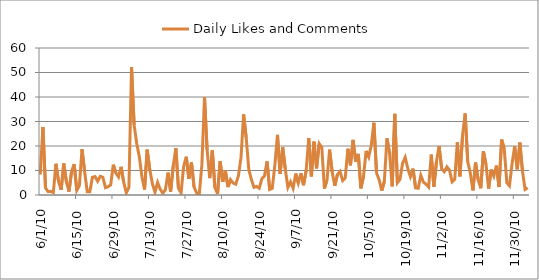
| Category | Daily Likes and Comments |
|---|---|
| 6/1/10 | 8.375 |
| 6/2/10 | 27.75 |
| 6/3/10 | 2.875 |
| 6/4/10 | 1.375 |
| 6/5/10 | 1.5 |
| 6/6/10 | 1 |
| 6/7/10 | 12.75 |
| 6/8/10 | 5.5 |
| 6/9/10 | 2.125 |
| 6/10/10 | 12.875 |
| 6/11/10 | 5.5 |
| 6/12/10 | 1.375 |
| 6/13/10 | 9.625 |
| 6/14/10 | 12.625 |
| 6/15/10 | 1.875 |
| 6/16/10 | 3.875 |
| 6/17/10 | 18.75 |
| 6/18/10 | 9.625 |
| 6/19/10 | 1.375 |
| 6/20/10 | 1.375 |
| 6/21/10 | 7.25 |
| 6/22/10 | 7.5 |
| 6/23/10 | 5.625 |
| 6/24/10 | 7.625 |
| 6/25/10 | 7.25 |
| 6/26/10 | 3 |
| 6/27/10 | 3.375 |
| 6/28/10 | 4.125 |
| 6/29/10 | 12.375 |
| 6/30/10 | 9 |
| 7/1/10 | 7.375 |
| 7/2/10 | 11.5 |
| 7/3/10 | 5.25 |
| 7/4/10 | 0.875 |
| 7/5/10 | 3.125 |
| 7/6/10 | 52.25 |
| 7/7/10 | 28.5 |
| 7/8/10 | 21 |
| 7/9/10 | 15.5 |
| 7/10/10 | 7.375 |
| 7/11/10 | 2.25 |
| 7/12/10 | 18.5 |
| 7/13/10 | 10.375 |
| 7/14/10 | 4.625 |
| 7/15/10 | 1.125 |
| 7/16/10 | 5.125 |
| 7/17/10 | 2.375 |
| 7/18/10 | 0.75 |
| 7/19/10 | 2.125 |
| 7/20/10 | 9.125 |
| 7/21/10 | 1.375 |
| 7/22/10 | 11.875 |
| 7/23/10 | 19.125 |
| 7/24/10 | 2.75 |
| 7/25/10 | 0.875 |
| 7/26/10 | 11.625 |
| 7/27/10 | 15.625 |
| 7/28/10 | 6.625 |
| 7/29/10 | 13.25 |
| 7/30/10 | 3.25 |
| 7/31/10 | 0.75 |
| 8/1/10 | 0.375 |
| 8/2/10 | 12.5 |
| 8/3/10 | 40 |
| 8/4/10 | 18.375 |
| 8/5/10 | 6.875 |
| 8/6/10 | 18.25 |
| 8/7/10 | 3 |
| 8/8/10 | 0.5 |
| 8/9/10 | 13.75 |
| 8/10/10 | 5.375 |
| 8/11/10 | 10 |
| 8/12/10 | 3.25 |
| 8/13/10 | 6.25 |
| 8/14/10 | 4.875 |
| 8/15/10 | 4.375 |
| 8/16/10 | 7.75 |
| 8/17/10 | 15.25 |
| 8/18/10 | 32.875 |
| 8/19/10 | 23.375 |
| 8/20/10 | 10.375 |
| 8/21/10 | 6.25 |
| 8/22/10 | 3.125 |
| 8/23/10 | 3.5 |
| 8/24/10 | 2.75 |
| 8/25/10 | 6.625 |
| 8/26/10 | 7.75 |
| 8/27/10 | 13.75 |
| 8/28/10 | 2.25 |
| 8/29/10 | 2.75 |
| 8/30/10 | 12.25 |
| 8/31/10 | 24.5 |
| 9/1/10 | 8.625 |
| 9/2/10 | 19.5 |
| 9/3/10 | 10.5 |
| 9/4/10 | 3.125 |
| 9/5/10 | 5.375 |
| 9/6/10 | 2.75 |
| 9/7/10 | 8.75 |
| 9/8/10 | 4.875 |
| 9/9/10 | 8.875 |
| 9/10/10 | 4 |
| 9/11/10 | 10 |
| 9/12/10 | 23.25 |
| 9/13/10 | 7.625 |
| 9/14/10 | 21.75 |
| 9/15/10 | 10.875 |
| 9/16/10 | 21 |
| 9/17/10 | 19.5 |
| 9/18/10 | 2.625 |
| 9/19/10 | 6.125 |
| 9/20/10 | 18.5 |
| 9/21/10 | 9.25 |
| 9/22/10 | 3.75 |
| 9/23/10 | 8.375 |
| 9/24/10 | 9.625 |
| 9/25/10 | 5.875 |
| 9/26/10 | 7 |
| 9/27/10 | 18.875 |
| 9/28/10 | 12.125 |
| 9/29/10 | 22.5 |
| 9/30/10 | 13.625 |
| 10/1/10 | 16.75 |
| 10/2/10 | 2.75 |
| 10/3/10 | 7.5 |
| 10/4/10 | 18 |
| 10/5/10 | 15.5 |
| 10/6/10 | 20.375 |
| 10/7/10 | 29.5 |
| 10/8/10 | 9 |
| 10/9/10 | 6.25 |
| 10/10/10 | 1.75 |
| 10/11/10 | 5.5 |
| 10/12/10 | 23.125 |
| 10/13/10 | 17.125 |
| 10/14/10 | 3.5 |
| 10/15/10 | 33.125 |
| 10/16/10 | 5 |
| 10/17/10 | 6.375 |
| 10/18/10 | 13 |
| 10/19/10 | 15.375 |
| 10/20/10 | 10.75 |
| 10/21/10 | 7.5 |
| 10/22/10 | 10.75 |
| 10/23/10 | 2.875 |
| 10/24/10 | 2.75 |
| 10/25/10 | 8 |
| 10/26/10 | 5.25 |
| 10/27/10 | 4.375 |
| 10/28/10 | 3.25 |
| 10/29/10 | 16.5 |
| 10/30/10 | 3.375 |
| 10/31/10 | 13.625 |
| 11/1/10 | 20 |
| 11/2/10 | 10.625 |
| 11/3/10 | 9.5 |
| 11/4/10 | 11.5 |
| 11/5/10 | 10.125 |
| 11/6/10 | 5.375 |
| 11/7/10 | 6.375 |
| 11/8/10 | 21.5 |
| 11/9/10 | 7.625 |
| 11/10/10 | 24.25 |
| 11/11/10 | 33.25 |
| 11/12/10 | 13.5 |
| 11/13/10 | 8.875 |
| 11/14/10 | 1.875 |
| 11/15/10 | 13.25 |
| 11/16/10 | 6.25 |
| 11/17/10 | 2.75 |
| 11/18/10 | 17.875 |
| 11/19/10 | 12.5 |
| 11/20/10 | 2.625 |
| 11/21/10 | 10.375 |
| 11/22/10 | 7.75 |
| 11/23/10 | 12 |
| 11/24/10 | 3.25 |
| 11/25/10 | 22.625 |
| 11/26/10 | 18.875 |
| 11/27/10 | 5 |
| 11/28/10 | 3.75 |
| 11/29/10 | 12.75 |
| 11/30/10 | 19.875 |
| 12/1/10 | 10.5 |
| 12/2/10 | 21.375 |
| 12/3/10 | 9.625 |
| 12/4/10 | 2.25 |
| 12/5/10 | 3 |